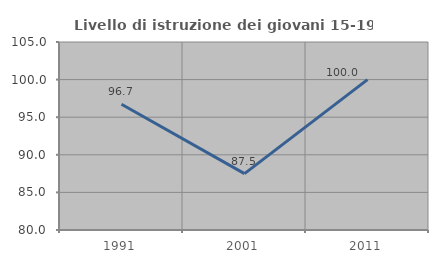
| Category | Livello di istruzione dei giovani 15-19 anni |
|---|---|
| 1991.0 | 96.721 |
| 2001.0 | 87.5 |
| 2011.0 | 100 |